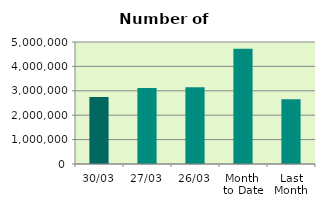
| Category | Series 0 |
|---|---|
| 30/03 | 2749506 |
| 27/03 | 3118478 |
| 26/03 | 3150024 |
| Month 
to Date | 4727744.286 |
| Last
Month | 2656039 |